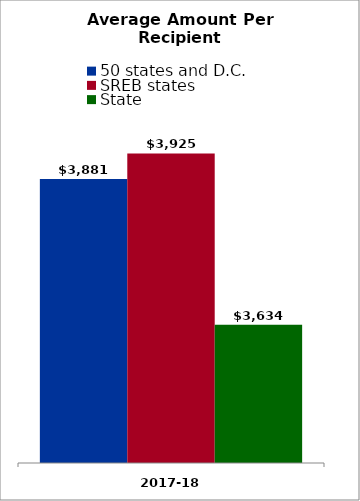
| Category | 50 states and D.C. | SREB states | State |
|---|---|---|---|
| 2017-18 | 3881.163 | 3924.596 | 3634.204 |